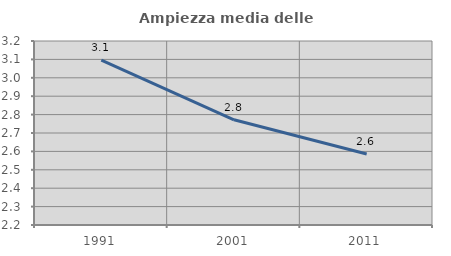
| Category | Ampiezza media delle famiglie |
|---|---|
| 1991.0 | 3.097 |
| 2001.0 | 2.772 |
| 2011.0 | 2.586 |